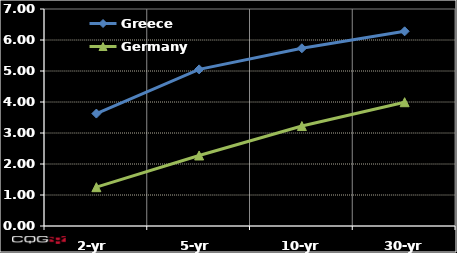
| Category | Greece | Germany |
|---|---|---|
| 2-yr | 3.627 | 1.252 |
| 5-yr | 5.052 | 2.275 |
| 10-yr | 5.733 | 3.224 |
| 30-yr | 6.28 | 3.993 |